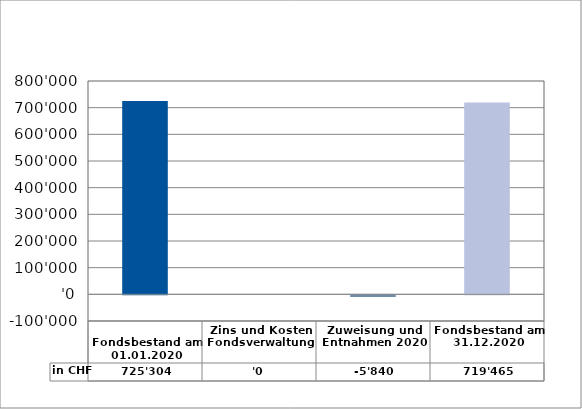
| Category | in CHF |
|---|---|
| 
Fondsbestand am 01.01.2020

 | 725304.25 |
| Zins und Kosten Fondsverwaltung | 0 |
| Zuweisung und Entnahmen 2020 | -5839.6 |
| Fondsbestand am 31.12.2020 | 719464.65 |